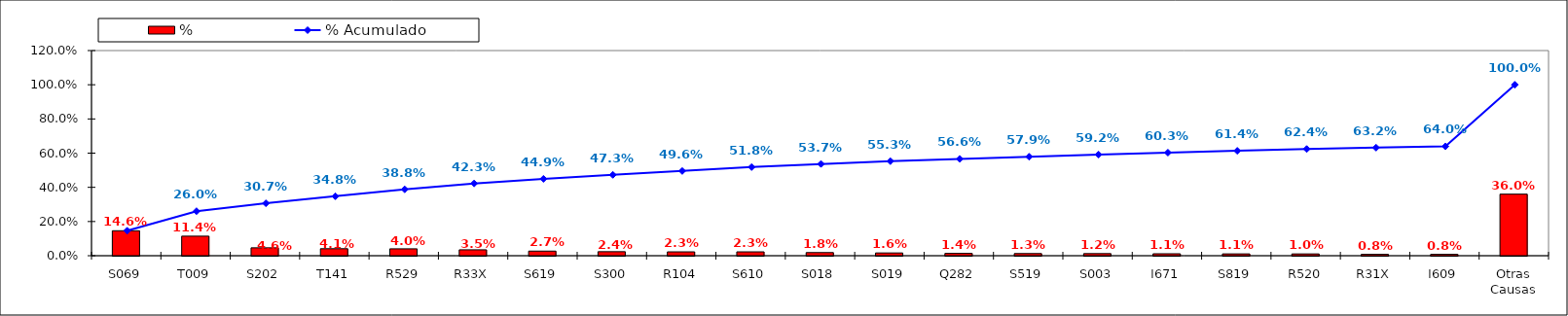
| Category | % |
|---|---|
| S069 | 0.146 |
| T009 | 0.114 |
| S202 | 0.046 |
| T141 | 0.041 |
| R529 | 0.04 |
| R33X | 0.035 |
| S619 | 0.027 |
| S300 | 0.024 |
| R104 | 0.023 |
| S610 | 0.023 |
| S018 | 0.018 |
| S019 | 0.016 |
| Q282 | 0.014 |
| S519 | 0.013 |
| S003 | 0.012 |
| I671 | 0.011 |
| S819 | 0.011 |
| R520 | 0.01 |
| R31X | 0.008 |
| I609 | 0.008 |
| Otras Causas | 0.36 |